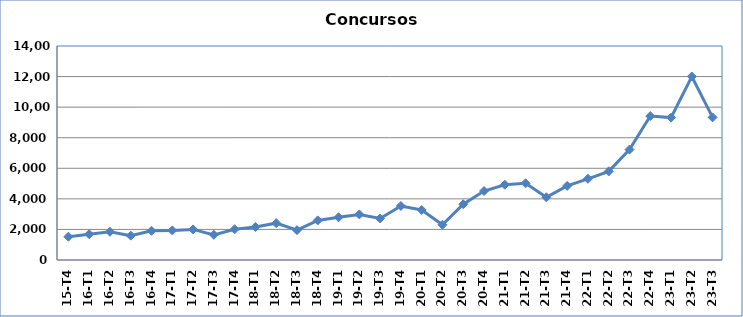
| Category | Series 0 |
|---|---|
| 15-T4 | 1526 |
| 16-T1 | 1689 |
| 16-T2 | 1847 |
| 16-T3 | 1593 |
| 16-T4 | 1911 |
| 17-T1 | 1937 |
| 17-T2 | 2001 |
| 17-T3 | 1645 |
| 17-T4 | 2011 |
| 18-T1 | 2162 |
| 18-T2 | 2410 |
| 18-T3 | 1953 |
| 18-T4 | 2590 |
| 19-T1 | 2796 |
| 19-T2 | 2982 |
| 19-T3 | 2719 |
| 19-T4 | 3534 |
| 20-T1 | 3274 |
| 20-T2 | 2305 |
| 20-T3 | 3649 |
| 20-T4 | 4513 |
| 21-T1 | 4925 |
| 21-T2 | 5017 |
| 21-T3 | 4101 |
| 21-T4 | 4849 |
| 22-T1 | 5312 |
| 22-T2 | 5798 |
| 22-T3 | 7225 |
| 22-T4 | 9416 |
| 23-T1 | 9316 |
| 23-T2 | 12006 |
| 23-T3 | 9330 |